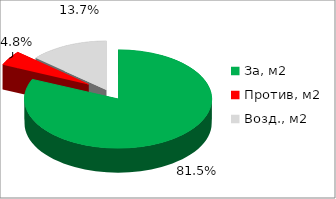
| Category | Series 0 |
|---|---|
| За, м2 | 0.815 |
| Против, м2 | 0.048 |
| Возд., м2 | 0.137 |